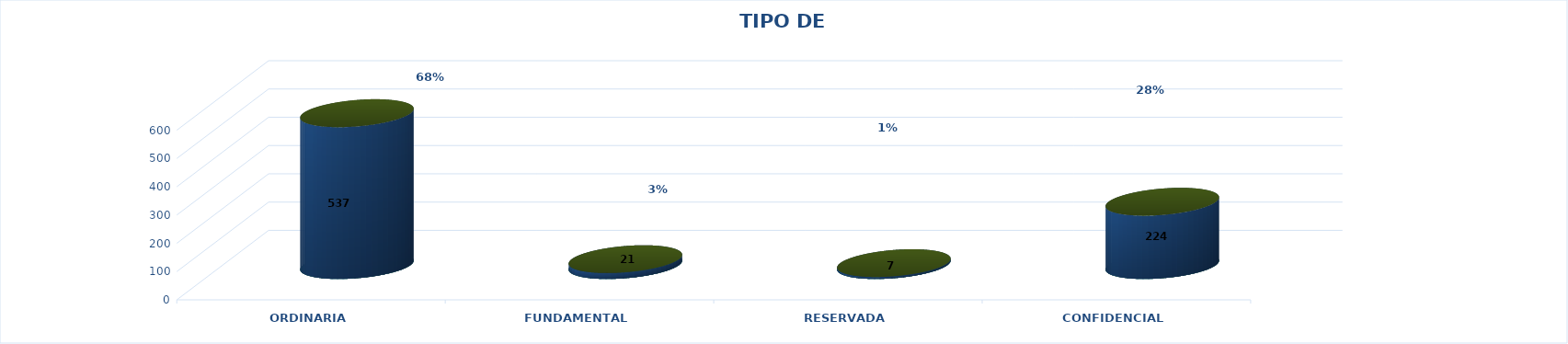
| Category | Series 0 | Series 2 | Series 1 | Series 3 | Series 4 |
|---|---|---|---|---|---|
| ORDINARIA |  |  |  | 537 | 0.681 |
| FUNDAMENTAL |  |  |  | 21 | 0.027 |
| RESERVADA |  |  |  | 7 | 0.009 |
| CONFIDENCIAL |  |  |  | 224 | 0.284 |